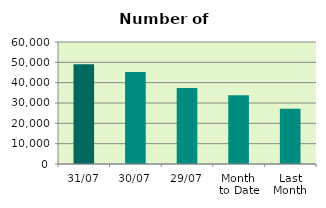
| Category | Series 0 |
|---|---|
| 31/07 | 49116 |
| 30/07 | 45264 |
| 29/07 | 37318 |
| Month 
to Date | 33803.652 |
| Last
Month | 27125.1 |